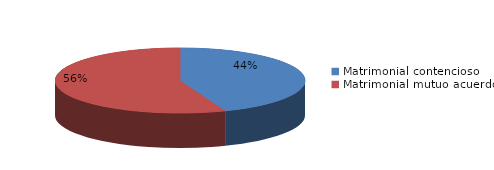
| Category | Series 0 |
|---|---|
| 0 | 780 |
| 1 | 988 |